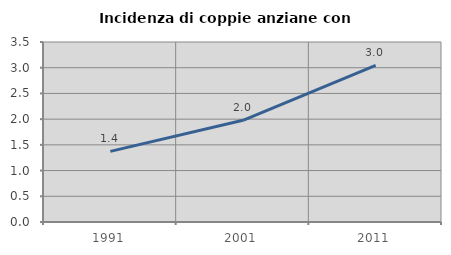
| Category | Incidenza di coppie anziane con figli |
|---|---|
| 1991.0 | 1.373 |
| 2001.0 | 1.978 |
| 2011.0 | 3.044 |